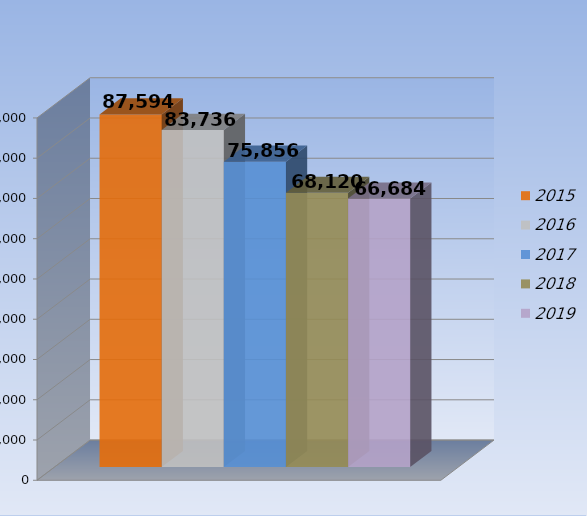
| Category | 2015 | 2016 | 2017 | 2018 | 2019 |
|---|---|---|---|---|---|
| 0 | 87594 | 83736 | 75856 | 68120 | 66684 |